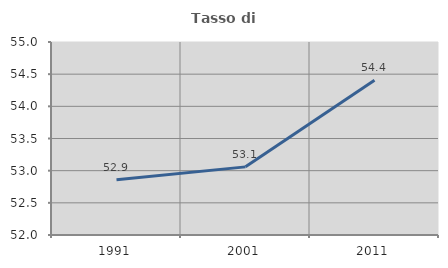
| Category | Tasso di occupazione   |
|---|---|
| 1991.0 | 52.861 |
| 2001.0 | 53.059 |
| 2011.0 | 54.405 |